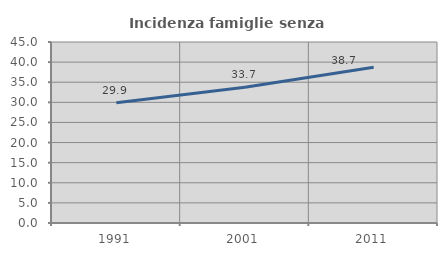
| Category | Incidenza famiglie senza nuclei |
|---|---|
| 1991.0 | 29.88 |
| 2001.0 | 33.735 |
| 2011.0 | 38.742 |